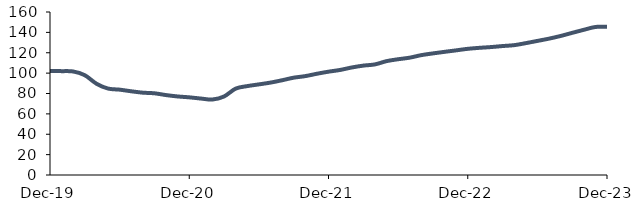
| Category | Series 0 |
|---|---|
| 2019-12-01 | 102.142 |
| 2020-01-01 | 101.951 |
| 2020-02-01 | 101.62 |
| 2020-03-01 | 97.938 |
| 2020-04-01 | 89.65 |
| 2020-05-01 | 84.839 |
| 2020-06-01 | 83.781 |
| 2020-07-01 | 82.182 |
| 2020-08-01 | 80.808 |
| 2020-09-01 | 80.198 |
| 2020-10-01 | 78.439 |
| 2020-11-01 | 77.102 |
| 2020-12-01 | 76.237 |
| 2021-01-01 | 75.045 |
| 2021-02-01 | 74.096 |
| 2021-03-01 | 77.079 |
| 2021-04-01 | 84.788 |
| 2021-05-01 | 87.267 |
| 2021-06-01 | 88.947 |
| 2021-07-01 | 90.706 |
| 2021-08-01 | 93 |
| 2021-09-01 | 95.533 |
| 2021-10-01 | 97.064 |
| 2021-11-01 | 99.379 |
| 2021-12-01 | 101.416 |
| 2022-01-01 | 103.119 |
| 2022-02-01 | 105.529 |
| 2022-03-01 | 107.371 |
| 2022-04-01 | 108.553 |
| 2022-05-01 | 111.761 |
| 2022-06-01 | 113.626 |
| 2022-07-01 | 115.177 |
| 2022-08-01 | 117.668 |
| 2022-09-01 | 119.358 |
| 2022-10-01 | 120.89 |
| 2022-11-01 | 122.346 |
| 2022-12-01 | 123.861 |
| 2023-01-01 | 124.823 |
| 2023-02-01 | 125.58 |
| 2023-03-01 | 126.574 |
| 2023-04-01 | 127.453 |
| 2023-05-01 | 129.424 |
| 2023-06-01 | 131.612 |
| 2023-07-01 | 133.833 |
| 2023-08-01 | 136.462 |
| 2023-09-01 | 139.531 |
| 2023-10-01 | 142.523 |
| 2023-11-01 | 145.297 |
| 2023-12-01 | 145.546 |